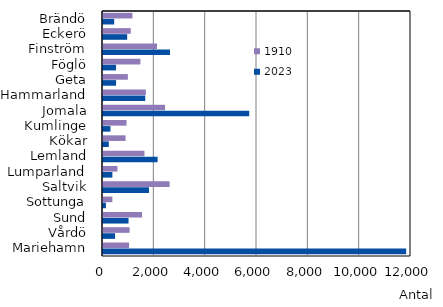
| Category | 1910 | 2023 |
|---|---|---|
| Brändö | 1147 | 436 |
| Eckerö | 1082 | 942 |
| Finström | 2105 | 2610 |
| Föglö | 1457 | 509 |
| Geta | 969 | 509 |
| Hammarland | 1669 | 1646 |
| Jomala | 2418 | 5697 |
| Kumlinge | 917 | 290 |
| Kökar | 879 | 225 |
| Lemland | 1615 | 2127 |
| Lumparland | 564 | 366 |
| Saltvik | 2595 | 1791 |
| Sottunga | 366 | 115 |
| Sund | 1521 | 995 |
| Vårdö | 1037 | 471 |
| Mariehamn | 1015 | 11812 |